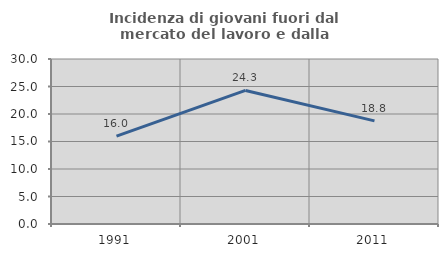
| Category | Incidenza di giovani fuori dal mercato del lavoro e dalla formazione  |
|---|---|
| 1991.0 | 15.986 |
| 2001.0 | 24.286 |
| 2011.0 | 18.75 |